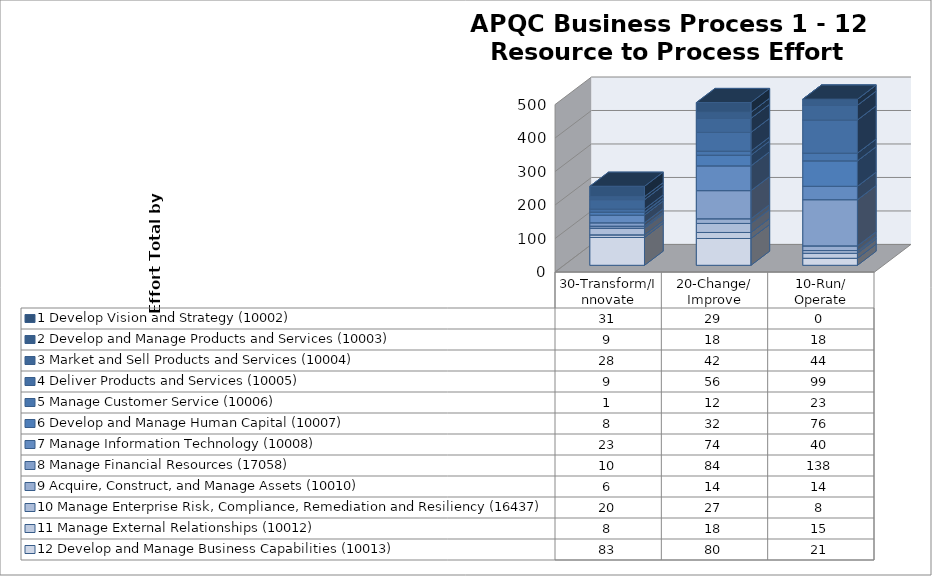
| Category | 12 Develop and Manage Business Capabilities (10013) | 11 Manage External Relationships (10012)  | 10 Manage Enterprise Risk, Compliance, Remediation and Resiliency (16437) | 9 Acquire, Construct, and Manage Assets (10010) | 8 Manage Financial Resources (17058) | 7 Manage Information Technology (10008) | 6 Develop and Manage Human Capital (10007) | 5 Manage Customer Service (10006) | 4 Deliver Products and Services (10005) | 3 Market and Sell Products and Services (10004) | 2 Develop and Manage Products and Services (10003) | 1 Develop Vision and Strategy (10002) |
|---|---|---|---|---|---|---|---|---|---|---|---|---|
| 30-Transform/Innovate | 83 | 8 | 20 | 6 | 10 | 23 | 8 | 1 | 9 | 28 | 9 | 31 |
| 20-Change/
Improve | 80 | 18 | 27 | 14 | 84 | 74 | 32 | 12 | 56 | 42 | 18 | 29 |
| 10-Run/
Operate | 21 | 15 | 8 | 14 | 138 | 40 | 76 | 23 | 99 | 44 | 18 | 0 |